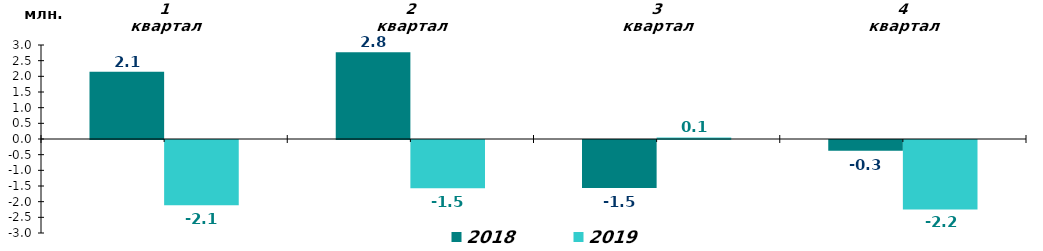
| Category | 2018 | 2019 |
|---|---|---|
| 1 квартал | 2.145 | -2.084 |
| 2 квартал | 2.77 | -1.537 |
| 3 квартал | -1.532 | 0.051 |
| 4 квартал | -0.341 | -2.217 |